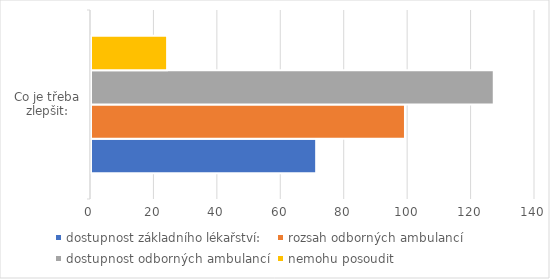
| Category | dostupnost základního lékařství:  | rozsah odborných ambulancí | dostupnost odborných ambulancí | nemohu posoudit |
|---|---|---|---|---|
| 0 | 71 | 99 | 127 | 24 |